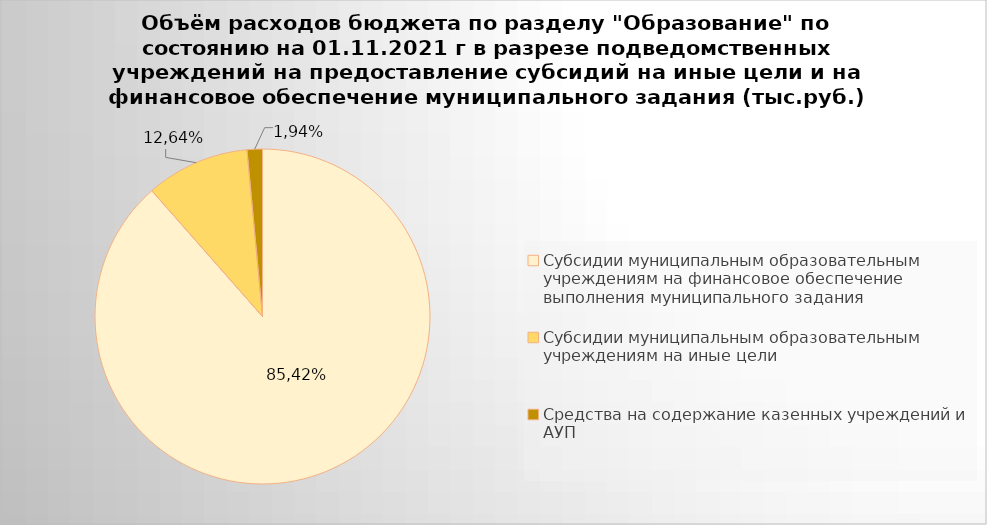
| Category | Series 0 |
|---|---|
| Субсидии муниципальным образовательным учреждениям на финансовое обеспечение выполнения муниципального задания | 6104948.04 |
| Субсидии муниципальным образовательным учреждениям на иные цели | 690132.24 |
| Средства на содержание казенных учреждений и АУП | 102075.01 |